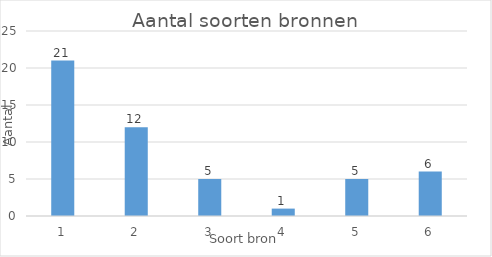
| Category | Series 0 |
|---|---|
| 0 | 21 |
| 1 | 12 |
| 2 | 5 |
| 3 | 1 |
| 4 | 5 |
| 5 | 6 |